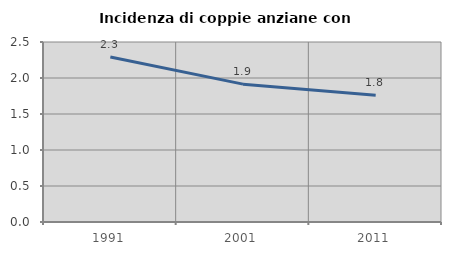
| Category | Incidenza di coppie anziane con figli |
|---|---|
| 1991.0 | 2.293 |
| 2001.0 | 1.915 |
| 2011.0 | 1.762 |